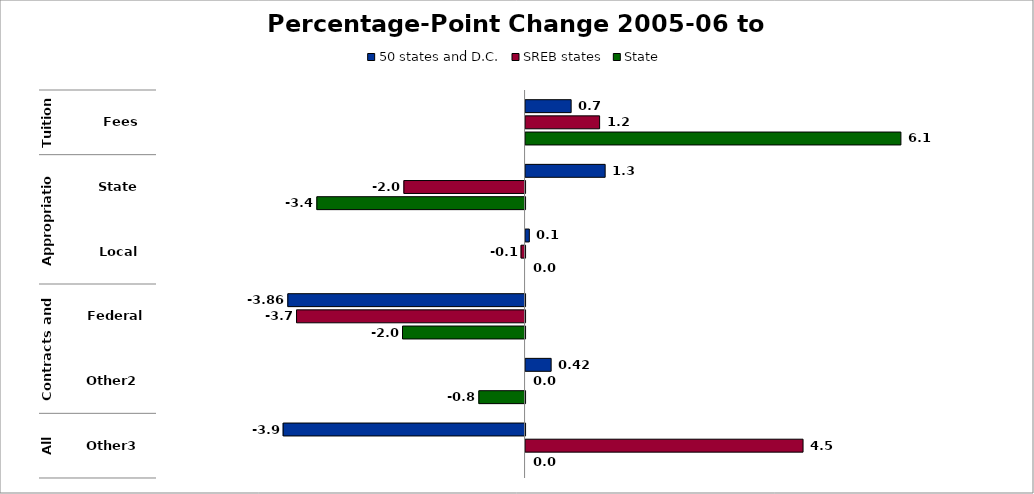
| Category | 50 states and D.C. | SREB states | State |
|---|---|---|---|
| 0 | 0.742 | 1.205 | 6.11 |
| 1 | 1.296 | -1.973 | -3.389 |
| 2 | 0.061 | -0.065 | 0 |
| 3 | -3.862 | -3.72 | -1.995 |
| 4 | 0.416 | 0 | -0.752 |
| 5 | -3.938 | 4.517 | 0 |